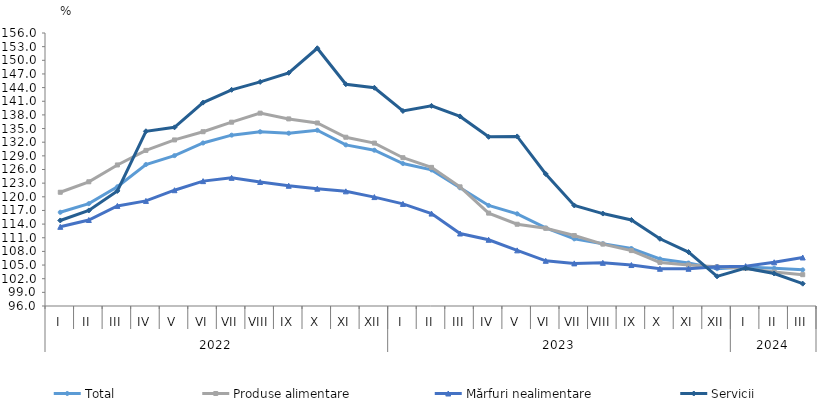
| Category | Total  | Produse alimentare | Mărfuri nealimentare  | Servicii |
|---|---|---|---|---|
| 0 | 116.6 | 121 | 113.4 | 114.8 |
| 1 | 118.5 | 123.3 | 114.9 | 117 |
| 2 | 122.2 | 127 | 118 | 121.3 |
| 3 | 127.1 | 130.2 | 119.1 | 134.4 |
| 4 | 129.047 | 132.5 | 121.45 | 135.267 |
| 5 | 131.827 | 134.301 | 123.443 | 140.701 |
| 6 | 133.547 | 136.399 | 124.168 | 143.511 |
| 7 | 134.294 | 138.387 | 123.256 | 145.253 |
| 8 | 133.971 | 137.121 | 122.424 | 147.248 |
| 9 | 134.625 | 136.226 | 121.779 | 152.646 |
| 10 | 131.406 | 133.093 | 121.201 | 144.742 |
| 11 | 130.241 | 131.801 | 119.936 | 143.965 |
| 12 | 127.307 | 128.59 | 118.441 | 138.865 |
| 13 | 125.91 | 126.47 | 116.31 | 139.99 |
| 14 | 121.977 | 122.19 | 111.932 | 137.666 |
| 15 | 118.102 | 116.414 | 110.554 | 133.178 |
| 16 | 116.262 | 113.97 | 108.228 | 133.268 |
| 17 | 113.152 | 113.076 | 105.931 | 125.017 |
| 18 | 110.755 | 111.48 | 105.365 | 118.101 |
| 19 | 109.689 | 109.605 | 105.486 | 116.313 |
| 20 | 108.634 | 108.179 | 105.004 | 114.916 |
| 21 | 106.342 | 105.575 | 104.182 | 110.77 |
| 22 | 105.453 | 105.022 | 104.182 | 107.863 |
| 23 | 104.199 | 104.62 | 104.612 | 102.522 |
| 24 | 104.552 | 104.242 | 104.76 | 104.317 |
| 25 | 104.308 | 103.467 | 105.607 | 103.141 |
| 26 | 103.944 | 102.883 | 106.66 | 100.906 |